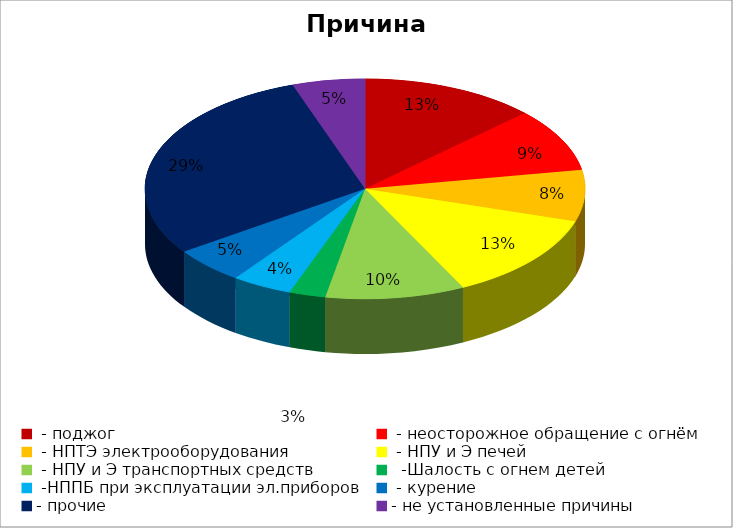
| Category | Причина пожара |
|---|---|
|  - поджог | 29 |
|  - неосторожное обращение с огнём | 21 |
|  - НПТЭ электрооборудования | 17 |
|  - НПУ и Э печей | 29 |
|  - НПУ и Э транспортных средств | 23 |
|   -Шалость с огнем детей | 6 |
|  -НППБ при эксплуатации эл.приборов | 10 |
|  - курение | 12 |
| - прочие | 66 |
| - не установленные причины | 12 |